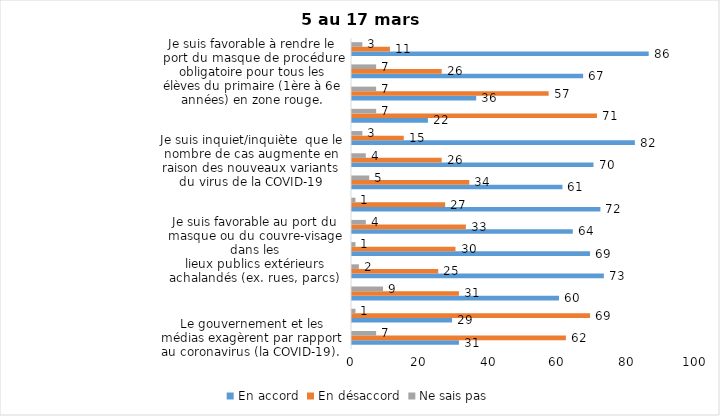
| Category | En accord | En désaccord | Ne sais pas |
|---|---|---|---|
| Le gouvernement et les médias exagèrent par rapport au coronavirus (la COVID-19). | 31 | 62 | 7 |
| Il est exagéré de rester chez soi pour se protéger contre le coronavirus (la COVID-19). | 29 | 69 | 1 |
| Les jeunes ne respectent pas les règles de confinement et contribuent à propager la COVID-19. | 60 | 31 | 9 |
| C’est une bonne chose que les policiers puissent donner facilement des contraventions aux gens qui ne respectent pas les mesures pour prévenir le coronavirus (la COVID-19). | 73 | 25 | 2 |
| Je suis favorable au port du masque ou du couvre-visage dans les
lieux publics extérieurs achalandés (ex. rues, parcs) | 69 | 30 | 1 |
| Les activités extérieures en petits groupes sont sécuritaires pour éviter la propagation de la COVID-19. | 64 | 33 | 4 |
| Je suis favorable au maintien du couvre-feu pour les prochaines semaines. | 72 | 27 | 1 |
| J’ai peur que le système de santé soit débordé par les cas de COVID-19 suite à l’assouplissement des mesures | 61 | 34 | 5 |
| Je suis inquiet/inquiète  que le nombre de cas augmente en raison des nouveaux variants du virus de la COVID-19 | 70 | 26 | 4 |
| La frontière entre le Canada et les États-Unis devrait être fermée au moins jusqu’en septembre 2021 | 82 | 15 | 3 |
| Les personnes vaccinées contre la COVID-19 devraient avoir le droit de faire des rassemblements privés et de ne plus porter le masque dans les lieux publics. | 22 | 71 | 7 |
| Je crois que le gouvernement a implanté trop de mesures par rapport à ce que la santé publique recommandait (ex. : fermeture des restaurants). | 36 | 57 | 7 |
| Je suis favorable à rendre le port du masque de procédure obligatoire pour tous les élèves du primaire (1ère à 6e années) en zone rouge. | 67 | 26 | 7 |
| Pour éviter la propagation de la COVID-19, c’est une bonne chose que le gouvernement maintiennent des mesures préventives plus strictes pour les régions entourant Montréal. | 86 | 11 | 3 |